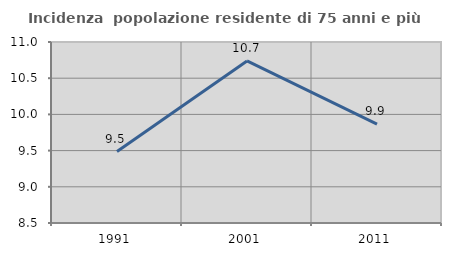
| Category | Incidenza  popolazione residente di 75 anni e più |
|---|---|
| 1991.0 | 9.487 |
| 2001.0 | 10.738 |
| 2011.0 | 9.865 |